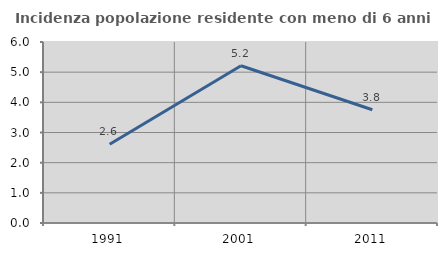
| Category | Incidenza popolazione residente con meno di 6 anni |
|---|---|
| 1991.0 | 2.61 |
| 2001.0 | 5.211 |
| 2011.0 | 3.753 |